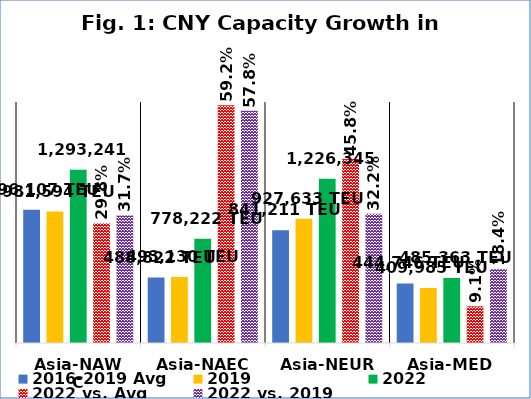
| Category | 2016-2019 Avg | 2019 | 2022 | 2022 vs. Avg | 2022 vs. 2019 |
|---|---|---|---|---|---|
| Asia-NAWC | 0.332 | 0.327 | 0.431 | 0.298 | 0.317 |
| Asia-NAEC | 0.163 | 0.164 | 0.259 | 0.592 | 0.578 |
| Asia-NEUR | 0.28 | 0.309 | 0.409 | 0.458 | 0.322 |
| Asia-MED | 0.148 | 0.137 | 0.162 | 0.091 | 0.184 |